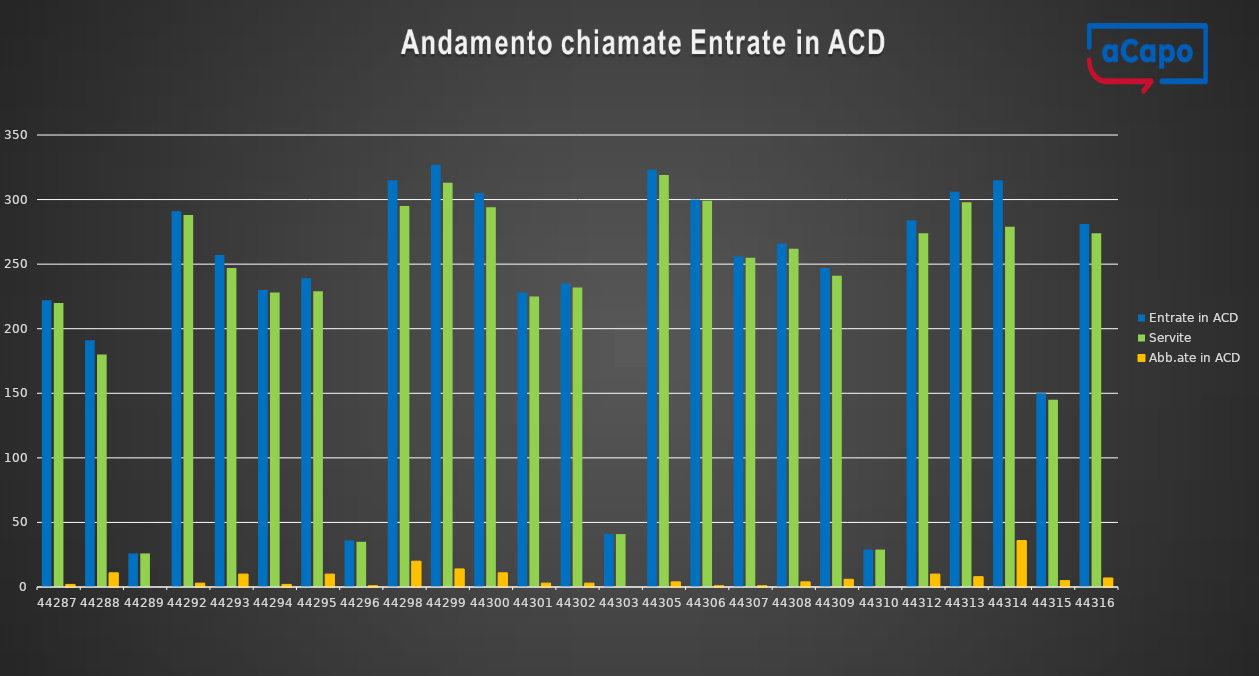
| Category | Entrate in ACD | Servite | Abb.ate in ACD |
|---|---|---|---|
| 44287.0 | 222 | 220 | 2 |
| 44288.0 | 191 | 180 | 11 |
| 44289.0 | 26 | 26 | 0 |
| 44292.0 | 291 | 288 | 3 |
| 44293.0 | 257 | 247 | 10 |
| 44294.0 | 230 | 228 | 2 |
| 44295.0 | 239 | 229 | 10 |
| 44296.0 | 36 | 35 | 1 |
| 44298.0 | 315 | 295 | 20 |
| 44299.0 | 327 | 313 | 14 |
| 44300.0 | 305 | 294 | 11 |
| 44301.0 | 228 | 225 | 3 |
| 44302.0 | 235 | 232 | 3 |
| 44303.0 | 41 | 41 | 0 |
| 44305.0 | 323 | 319 | 4 |
| 44306.0 | 300 | 299 | 1 |
| 44307.0 | 256 | 255 | 1 |
| 44308.0 | 266 | 262 | 4 |
| 44309.0 | 247 | 241 | 6 |
| 44310.0 | 29 | 29 | 0 |
| 44312.0 | 284 | 274 | 10 |
| 44313.0 | 306 | 298 | 8 |
| 44314.0 | 315 | 279 | 36 |
| 44315.0 | 150 | 145 | 5 |
| 44316.0 | 281 | 274 | 7 |